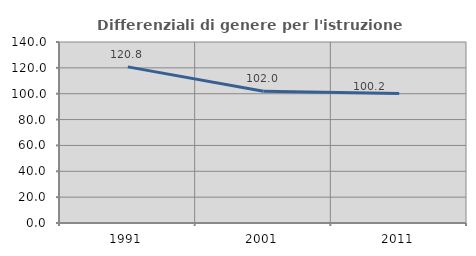
| Category | Differenziali di genere per l'istruzione superiore |
|---|---|
| 1991.0 | 120.759 |
| 2001.0 | 101.953 |
| 2011.0 | 100.169 |